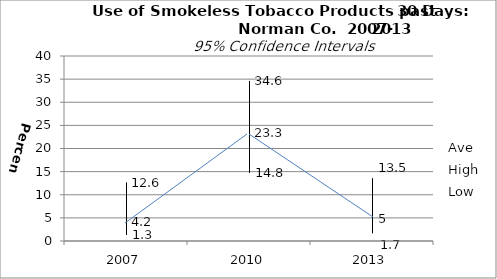
| Category | Ave | High | Low |
|---|---|---|---|
| 2007.0 | 4.2 | 12.6 | 1.3 |
| 2010.0 | 23.3 | 34.6 | 14.8 |
| 2013.0 | 5 | 13.5 | 1.7 |